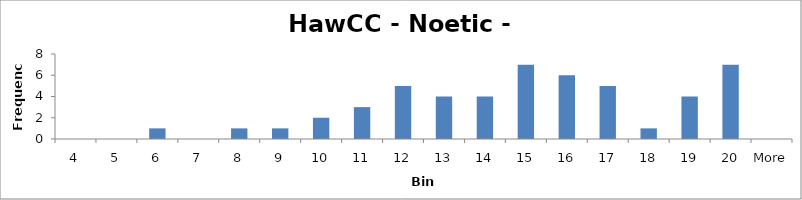
| Category | Frequency |
|---|---|
| 4 | 0 |
| 5 | 0 |
| 6 | 1 |
| 7 | 0 |
| 8 | 1 |
| 9 | 1 |
| 10 | 2 |
| 11 | 3 |
| 12 | 5 |
| 13 | 4 |
| 14 | 4 |
| 15 | 7 |
| 16 | 6 |
| 17 | 5 |
| 18 | 1 |
| 19 | 4 |
| 20 | 7 |
| More | 0 |